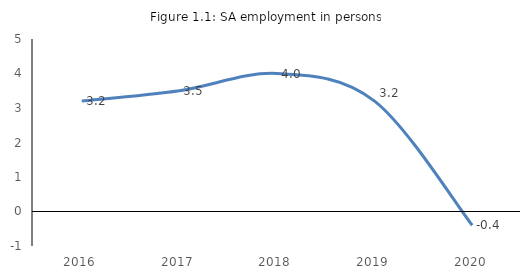
| Category | Employment SA (persons, Statistical Service) |
|---|---|
| 2016.0 | 3.2 |
| 2017.0 | 3.5 |
| 2018.0 | 4 |
| 2019.0 | 3.2 |
| 2020.0 | -0.4 |